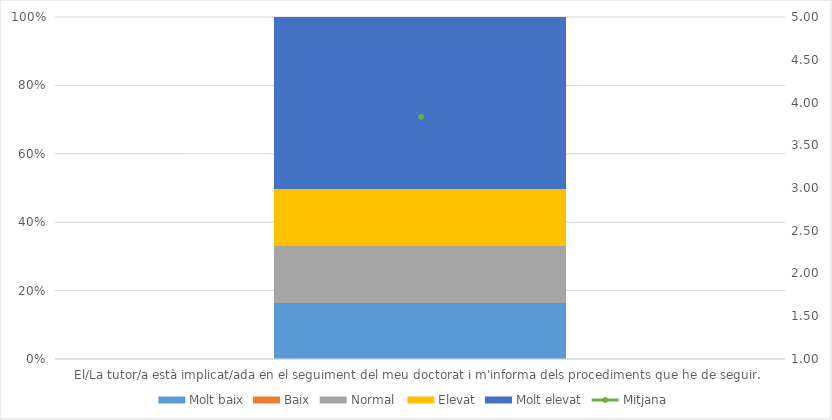
| Category | Molt baix | Baix | Normal  | Elevat | Molt elevat |
|---|---|---|---|---|---|
| El/La tutor/a està implicat/ada en el seguiment del meu doctorat i m'informa dels procediments que he de seguir.  | 1 | 0 | 1 | 1 | 3 |